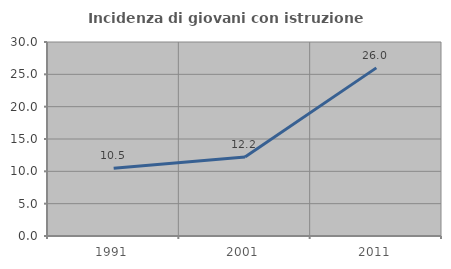
| Category | Incidenza di giovani con istruzione universitaria |
|---|---|
| 1991.0 | 10.487 |
| 2001.0 | 12.221 |
| 2011.0 | 26 |